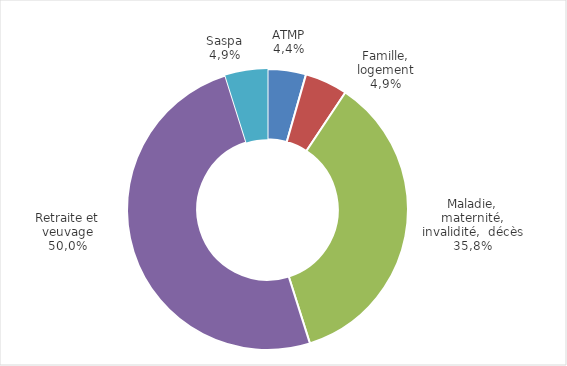
| Category | Series 0 |
|---|---|
| ATMP | 607.195 |
| Famille, logement | 675.276 |
| Maladie, maternité, invalidité, décès | 4910.861 |
| Retraite et veuvage | 6866.725 |
| SASPA | 667.16 |